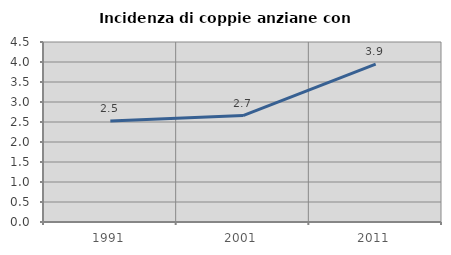
| Category | Incidenza di coppie anziane con figli |
|---|---|
| 1991.0 | 2.523 |
| 2001.0 | 2.661 |
| 2011.0 | 3.946 |